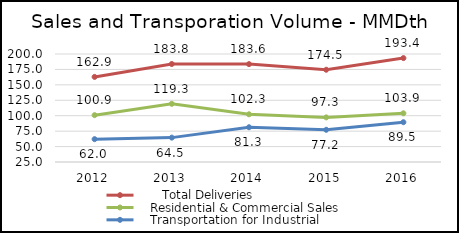
| Category |       Total Deliveries |    Residential & Commercial Sales |    Transportation for Industrial  |
|---|---|---|---|
| 2012.0 | 162.9 | 100.9 | 62 |
| 2013.0 | 183.8 | 119.3 | 64.5 |
| 2014.0 | 183.6 | 102.3 | 81.3 |
| 2015.0 | 174.5 | 97.3 | 77.2 |
| 2016.0 | 193.362 | 103.9 | 89.462 |